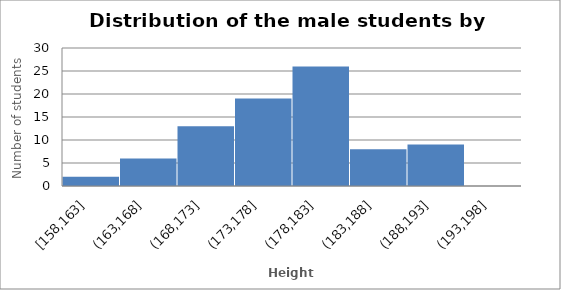
| Category | Series 0 |
|---|---|
| 152.5 | 0.014 |
| 157.5 | 0.072 |
| 162.5 | 0.173 |
| 167.5 | 0.158 |
| 172.5 | 0.194 |
| 177.5 | 0.173 |
| 182.5 | 0.122 |
| 187.5 | 0.079 |
| 192.5 | 0.014 |